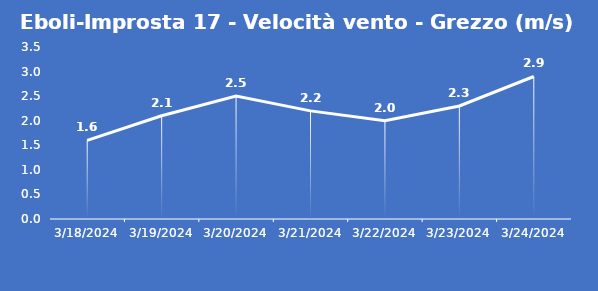
| Category | Eboli-Improsta 17 - Velocità vento - Grezzo (m/s) |
|---|---|
| 3/18/24 | 1.6 |
| 3/19/24 | 2.1 |
| 3/20/24 | 2.5 |
| 3/21/24 | 2.2 |
| 3/22/24 | 2 |
| 3/23/24 | 2.3 |
| 3/24/24 | 2.9 |